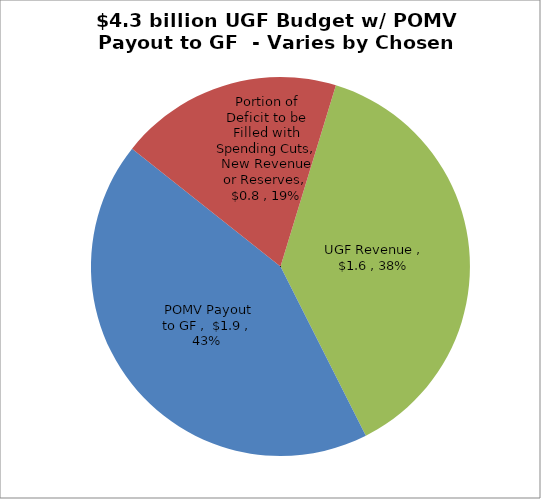
| Category | Series 0 |
|---|---|
| UGF Revenue | 1.624 |
| POMV Payout to GF | 1.85 |
| Portion of Deficit to be Filled with Spending Cuts, New Revenue or Reserves | 0.817 |